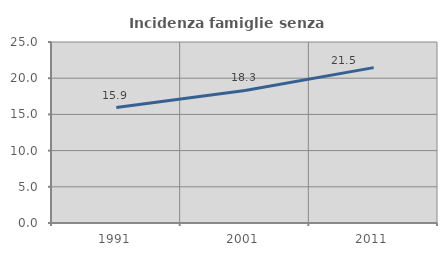
| Category | Incidenza famiglie senza nuclei |
|---|---|
| 1991.0 | 15.947 |
| 2001.0 | 18.314 |
| 2011.0 | 21.463 |